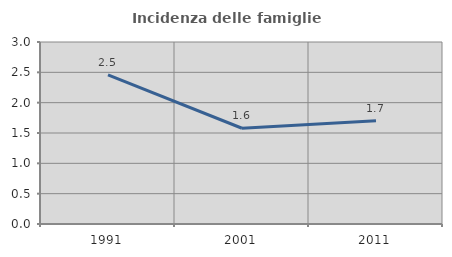
| Category | Incidenza delle famiglie numerose |
|---|---|
| 1991.0 | 2.457 |
| 2001.0 | 1.578 |
| 2011.0 | 1.702 |